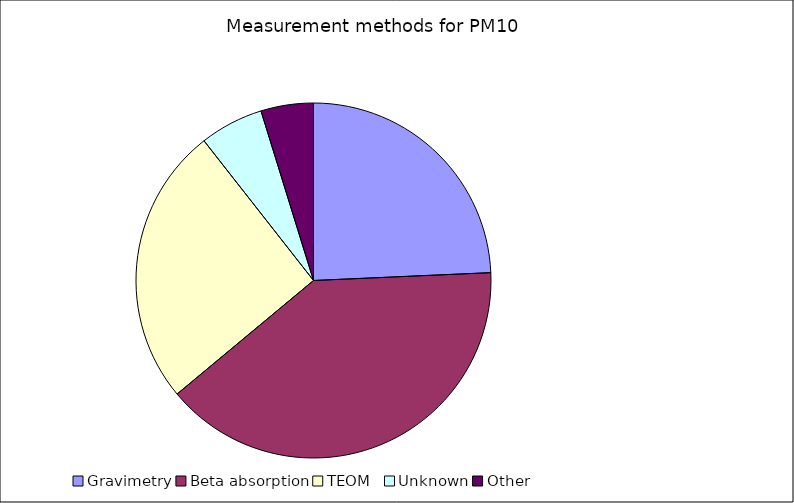
| Category | Series 0 |
|---|---|
| Gravimetry | 24.296 |
| Beta absorption | 39.658 |
| TEOM   | 25.464 |
| Unknown | 5.803 |
| Other | 4.78 |